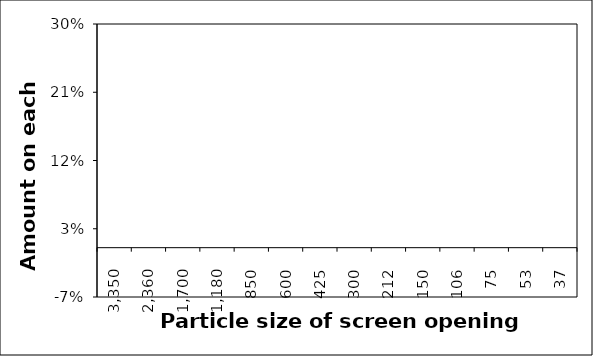
| Category | Wt |
|---|---|
| 3350.0 | 0 |
| 2360.0 | 0 |
| 1700.0 | 0 |
| 1180.0 | 0 |
| 850.0 | 0 |
| 600.0 | 0 |
| 425.0 | 0 |
| 300.0 | 0 |
| 212.0 | 0 |
| 150.0 | 0 |
| 106.0 | 0 |
| 75.0 | 0 |
| 53.0 | 0 |
| 37.0 | 0 |